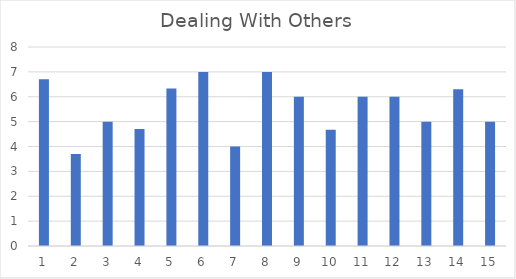
| Category | Dealing With Others |
|---|---|
| 0 | 6.7 |
| 1 | 3.7 |
| 2 | 5 |
| 3 | 4.7 |
| 4 | 6.33 |
| 5 | 7 |
| 6 | 4 |
| 7 | 7 |
| 8 | 6 |
| 9 | 4.67 |
| 10 | 6 |
| 11 | 6 |
| 12 | 5 |
| 13 | 6.3 |
| 14 | 5 |